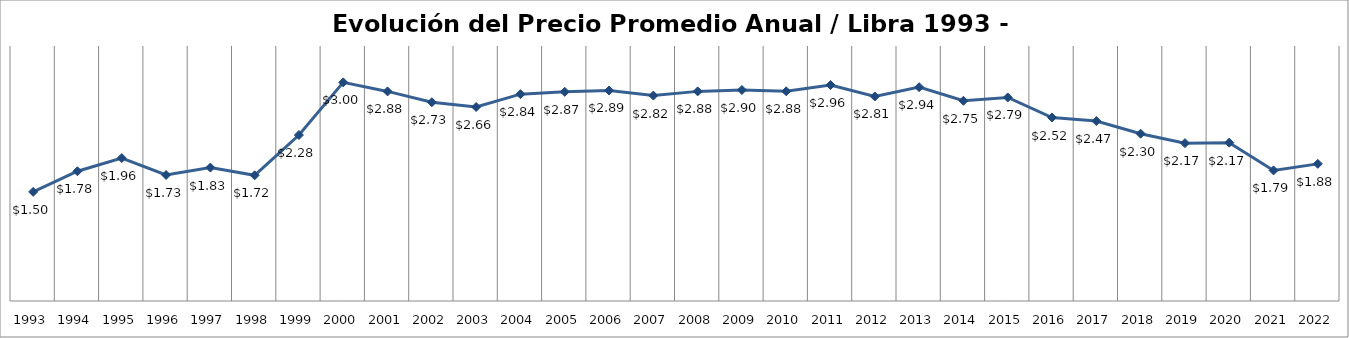
| Category | Series 0 |
|---|---|
| 1993.0 | 1.498 |
| 1994.0 | 1.781 |
| 1995.0 | 1.962 |
| 1996.0 | 1.73 |
| 1997.0 | 1.831 |
| 1998.0 | 1.725 |
| 1999.0 | 2.278 |
| 2000.0 | 3 |
| 2001.0 | 2.877 |
| 2002.0 | 2.728 |
| 2003.0 | 2.662 |
| 2004.0 | 2.839 |
| 2005.0 | 2.871 |
| 2006.0 | 2.889 |
| 2007.0 | 2.819 |
| 2008.0 | 2.877 |
| 2009.0 | 2.896 |
| 2010.0 | 2.879 |
| 2011.0 | 2.965 |
| 2012.0 | 2.807 |
| 2013.0 | 2.935 |
| 2014.0 | 2.748 |
| 2015.0 | 2.793 |
| 2016.0 | 2.519 |
| 2017.0 | 2.47 |
| 2018.0 | 2.297 |
| 2019.0 | 2.166 |
| 2020.0 | 2.173 |
| 2021.0 | 1.792 |
| 2022.0 | 1.882 |